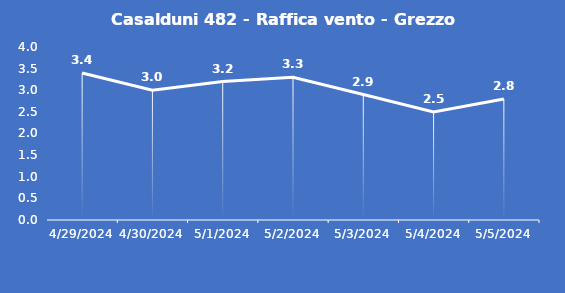
| Category | Casalduni 482 - Raffica vento - Grezzo (m/s) |
|---|---|
| 4/29/24 | 3.4 |
| 4/30/24 | 3 |
| 5/1/24 | 3.2 |
| 5/2/24 | 3.3 |
| 5/3/24 | 2.9 |
| 5/4/24 | 2.5 |
| 5/5/24 | 2.8 |